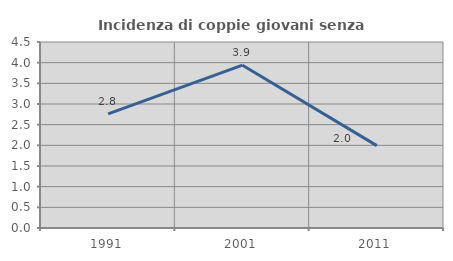
| Category | Incidenza di coppie giovani senza figli |
|---|---|
| 1991.0 | 2.762 |
| 2001.0 | 3.939 |
| 2011.0 | 1.993 |